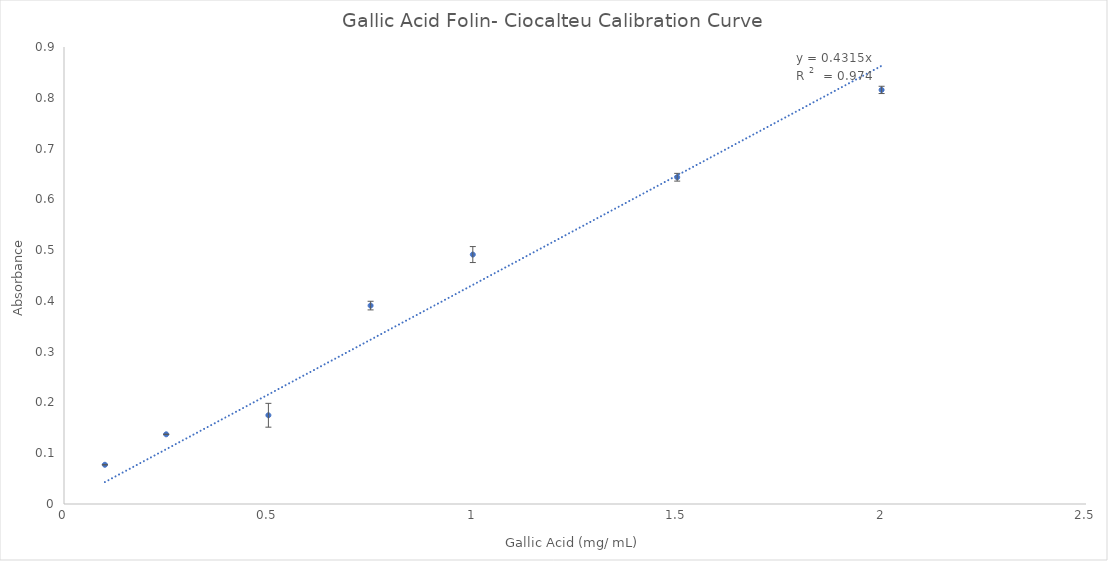
| Category | Concentration (mg/mL) |
|---|---|
| 2.0 | 0.816 |
| 1.5 | 0.644 |
| 1.0 | 0.491 |
| 0.75 | 0.391 |
| 0.5 | 0.175 |
| 0.25 | 0.137 |
| 0.1 | 0.077 |